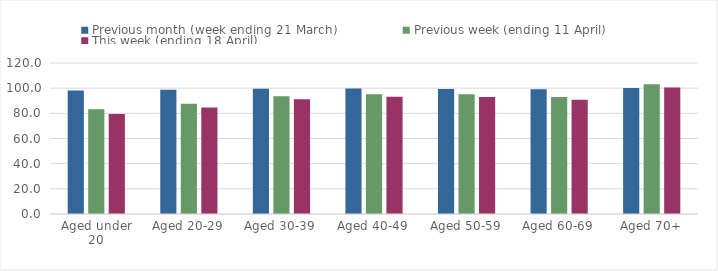
| Category | Previous month (week ending 21 March) | Previous week (ending 11 April) | This week (ending 18 April) |
|---|---|---|---|
| Aged under 20 | 98.092 | 83.303 | 79.41 |
| Aged 20-29 | 98.758 | 87.71 | 84.601 |
| Aged 30-39 | 99.446 | 93.546 | 91.226 |
| Aged 40-49 | 99.714 | 95.216 | 93.232 |
| Aged 50-59 | 99.392 | 95.211 | 92.94 |
| Aged 60-69 | 99.155 | 92.914 | 90.778 |
| Aged 70+ | 100.166 | 103.189 | 100.58 |